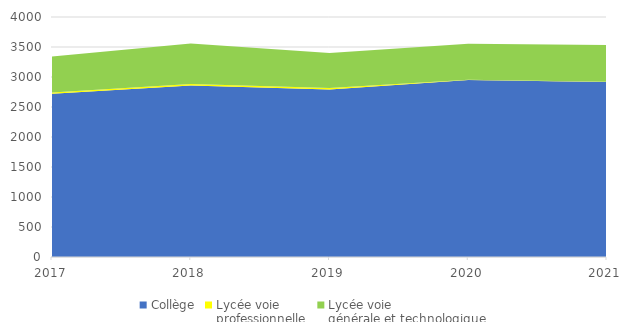
| Category | Collège | Lycée voie 
professionnelle | Lycée voie 
générale et technologique |
|---|---|---|---|
| 2017.0 | 2719 | 22 | 601 |
| 2018.0 | 2859 | 23 | 678 |
| 2019.0 | 2790 | 27 | 582 |
| 2020.0 | 2948 | 7 | 599 |
| 2021.0 | 2918 | 3 | 612 |